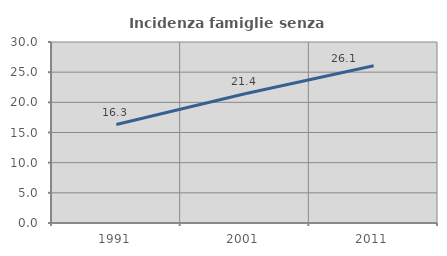
| Category | Incidenza famiglie senza nuclei |
|---|---|
| 1991.0 | 16.324 |
| 2001.0 | 21.429 |
| 2011.0 | 26.052 |